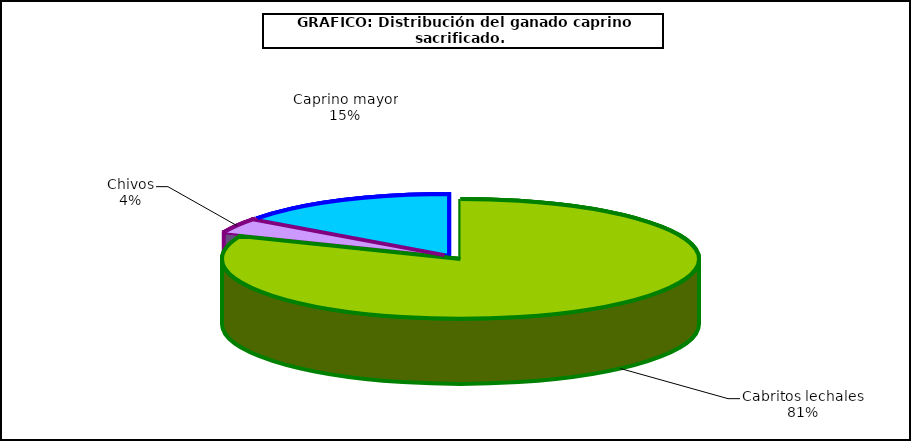
| Category | Series 0 |
|---|---|
| 0 | 1061299 |
| 1 | 51430 |
| 2 | 193715 |